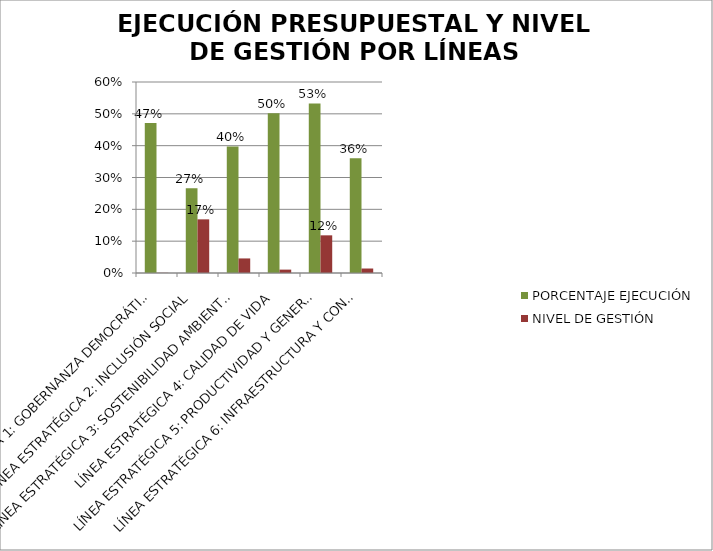
| Category | PORCENTAJE EJECUCIÓN | NIVEL DE GESTIÓN |
|---|---|---|
| LÍNEA ESTRATÉGICA 1: GOBERNANZA DEMOCRÁTICA | 0.472 | 0.001 |
| LÍNEA ESTRATÉGICA 2: INCLUSIÓN SOCIAL | 0.266 | 0.169 |
| LÍNEA ESTRATÉGICA 3: SOSTENIBILIDAD AMBIENTAL | 0.397 | 0.046 |
| LÍNEA ESTRATÉGICA 4: CALIDAD DE VIDA | 0.501 | 0.011 |
| LÍNEA ESTRATÉGICA 5: PRODUCTIVIDAD Y GENERACIÓN DE OPORTUNIDADES | 0.533 | 0.118 |
| LÍNEA ESTRATÉGICA 6: INFRAESTRUCTURA Y CONECTIVIDAD | 0.361 | 0.014 |